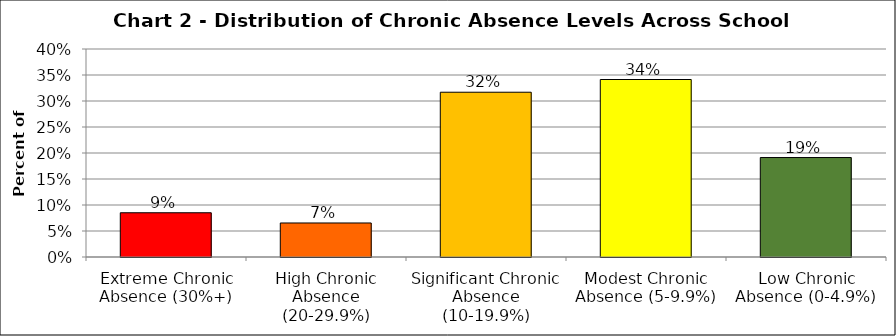
| Category | Series 1 |
|---|---|
| Extreme Chronic Absence (30%+) | 0.085 |
| High Chronic Absence (20-29.9%) | 0.065 |
| Significant Chronic Absence (10-19.9%) | 0.317 |
| Modest Chronic Absence (5-9.9%) | 0.341 |
| Low Chronic Absence (0-4.9%) | 0.191 |